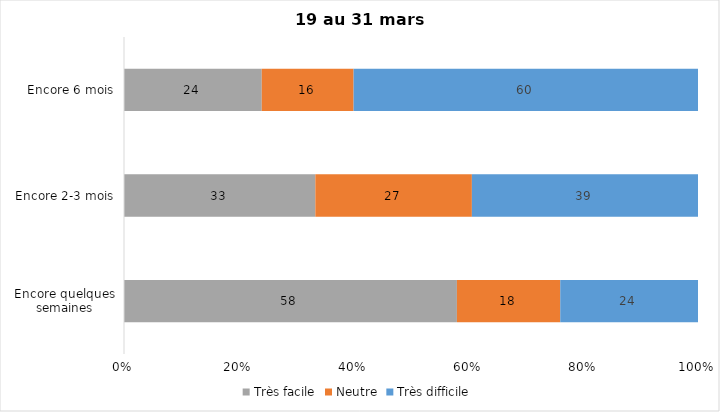
| Category | Très facile | Neutre | Très difficile |
|---|---|---|---|
| Encore quelques semaines | 58 | 18 | 24 |
| Encore 2-3 mois | 33 | 27 | 39 |
| Encore 6 mois | 24 | 16 | 60 |